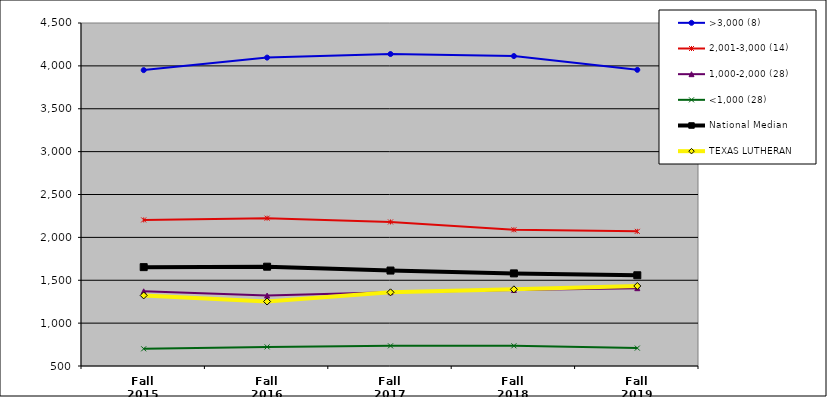
| Category | >3,000 (8) | 2,001-3,000 (14) | 1,000-2,000 (28) | <1,000 (28) | National Median | TEXAS LUTHERAN |
|---|---|---|---|---|---|---|
| Fall 2015 | 3950.5 | 2203.5 | 1371 | 700.5 | 1653 | 1323 |
| Fall 2016 | 4096.5 | 2224 | 1321.5 | 723 | 1658 | 1252 |
| Fall 2017 | 4138 | 2180 | 1361 | 735 | 1613 | 1359 |
| Fall 2018 | 4114.5 | 2088.5 | 1387 | 735.5 | 1580 | 1394 |
| Fall 2019 | 3954 | 2070.5 | 1407.5 | 709 | 1558 | 1433 |